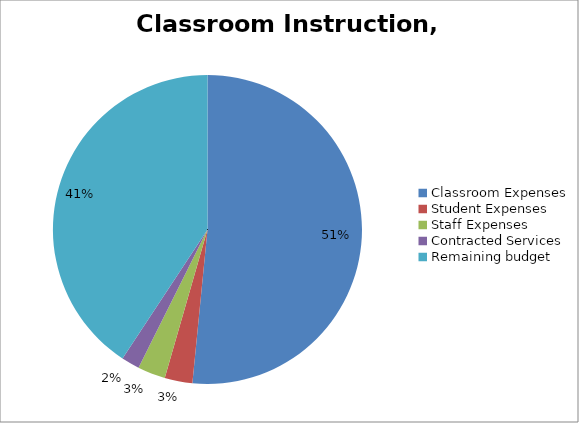
| Category | Series 0 |
|---|---|
| Classroom Expenses | 9427.357 |
| Student Expenses | 530.934 |
| Staff Expenses | 530.934 |
| Contracted Services | 347.989 |
| Remaining budget  | 7446.61 |